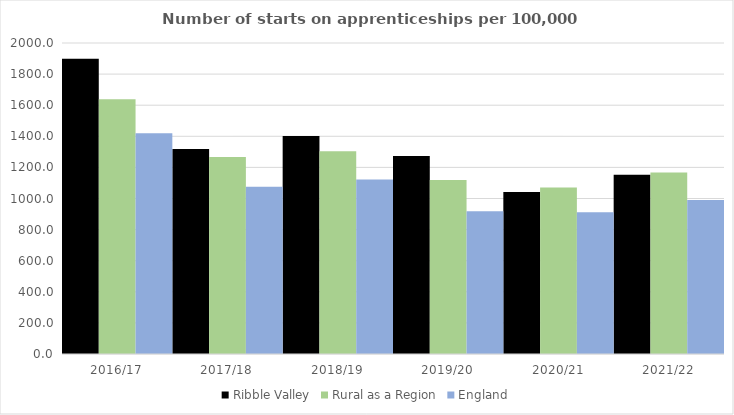
| Category | Ribble Valley | Rural as a Region | England |
|---|---|---|---|
| 2016/17 | 1898 | 1638.789 | 1420 |
| 2017/18 | 1319 | 1267.474 | 1075 |
| 2018/19 | 1402 | 1304.57 | 1122 |
| 2019/20 | 1273 | 1119.662 | 918 |
| 2020/21 | 1041 | 1070.748 | 912 |
| 2021/22 | 1152 | 1167.68 | 991 |